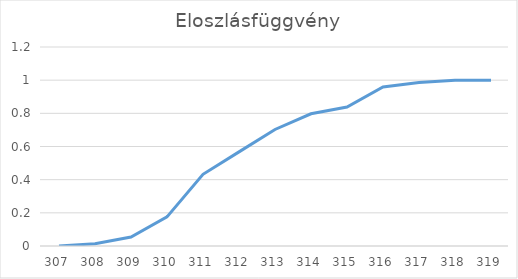
| Category | Series 0 |
|---|---|
| 307.0 | 0 |
| 308.0 | 0.014 |
| 309.0 | 0.054 |
| 310.0 | 0.176 |
| 311.0 | 0.432 |
| 312.0 | 0.568 |
| 313.0 | 0.703 |
| 314.0 | 0.797 |
| 315.0 | 0.838 |
| 316.0 | 0.959 |
| 317.0 | 0.986 |
| 318.0 | 1 |
| 319.0 | 1 |